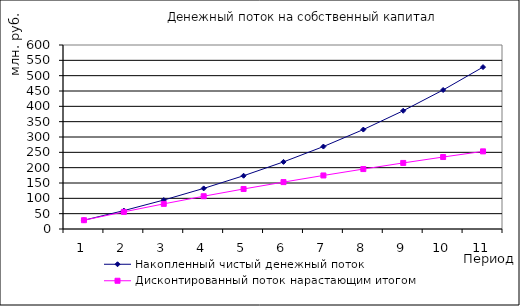
| Category | Накопленный чистый денежный поток | Дисконтированный поток нарастающим итогом |
|---|---|---|
| 0 | 28.647 | 28.647 |
| 1 | 59.956 | 55.872 |
| 2 | 94.445 | 81.951 |
| 3 | 132.383 | 106.895 |
| 4 | 173.663 | 130.498 |
| 5 | 218.81 | 152.944 |
| 6 | 268.832 | 174.57 |
| 7 | 324.242 | 195.4 |
| 8 | 385.617 | 215.464 |
| 9 | 453.315 | 234.708 |
| 10 | 527.987 | 253.166 |